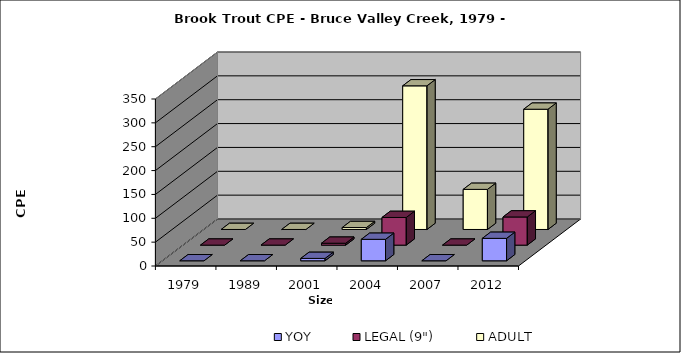
| Category | YOY | LEGAL (9") | ADULT |
|---|---|---|---|
| 1979.0 | 0 | 0 | 0 |
| 1989.0 | 0 | 0 | 0 |
| 2001.0 | 5 | 4 | 4 |
| 2004.0 | 45 | 58 | 301 |
| 2007.0 | 0 | 0 | 84 |
| 2012.0 | 47 | 59 | 252 |